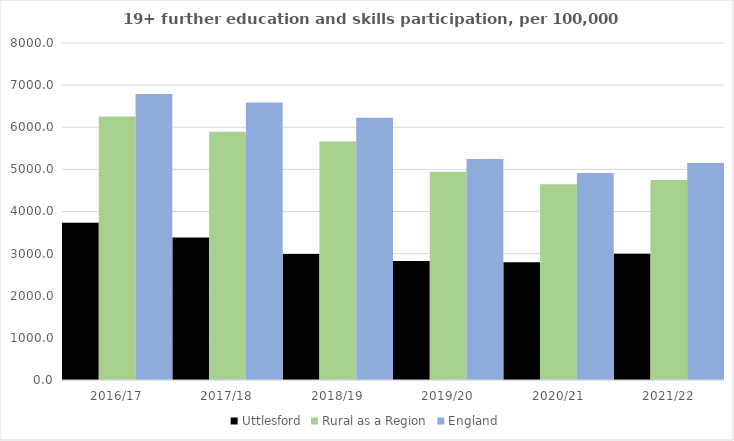
| Category | Uttlesford | Rural as a Region | England |
|---|---|---|---|
| 2016/17 | 3732 | 6253.401 | 6788 |
| 2017/18 | 3385 | 5892.029 | 6588 |
| 2018/19 | 2989 | 5661.873 | 6227 |
| 2019/20 | 2824 | 4943.801 | 5244 |
| 2020/21 | 2797 | 4646.727 | 4913 |
| 2021/22 | 2998 | 4747.049 | 5151 |